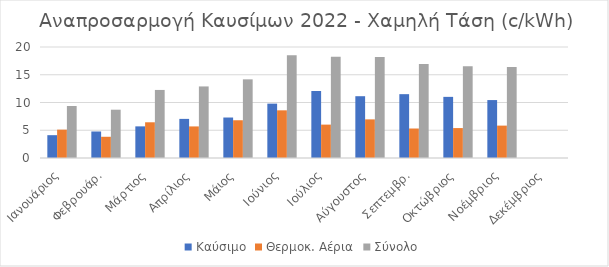
| Category | Καύσιμο | Θερμοκ. Αέρια | Σύνολο |
|---|---|---|---|
| Ιανουάριος | 4.113 | 5.111 | 9.374 |
| Φεβρουάρ. | 4.777 | 3.824 | 8.702 |
| Μάρτιος | 5.699 | 6.436 | 12.262 |
| Απρίλιος | 7.048 | 5.69 | 12.896 |
| Μάιος | 7.294 | 6.802 | 14.171 |
| Ιούνιος | 9.796 | 8.589 | 18.513 |
| Ιούλιος | 12.071 | 6.015 | 18.253 |
| Αύγουστος | 11.134 | 6.959 | 18.22 |
| Σεπτεμβρ. | 11.503 | 5.314 | 16.953 |
| Οκτώβριος | 11.015 | 5.392 | 16.551 |
| Νοέμβριος | 10.438 | 5.835 | 16.399 |
| Δεκέμβριος | 0 | 0 | 0 |